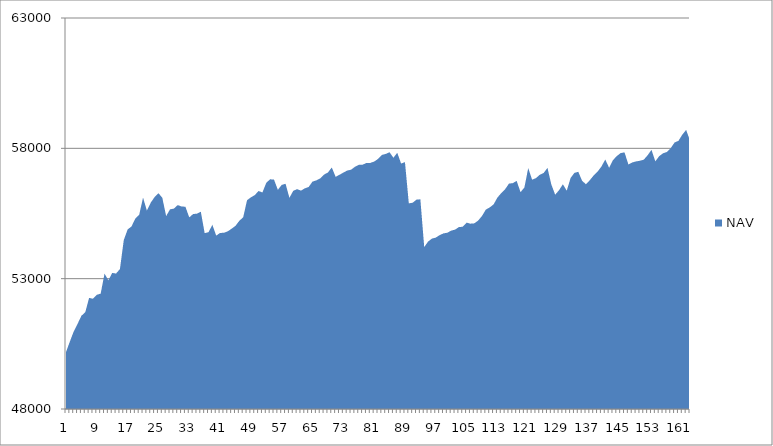
| Category | NAV |
|---|---|
| 0 | 50185.185 |
| 1 | 50585.185 |
| 2 | 50973.977 |
| 3 | 51265.977 |
| 4 | 51576.741 |
| 5 | 51711.523 |
| 6 | 52262.893 |
| 7 | 52230.24 |
| 8 | 52381.556 |
| 9 | 52425.915 |
| 10 | 53192.581 |
| 11 | 52939.146 |
| 12 | 53220.069 |
| 13 | 53197.341 |
| 14 | 53369.61 |
| 15 | 54480.721 |
| 16 | 54888.365 |
| 17 | 55001.902 |
| 18 | 55308.308 |
| 19 | 55448.308 |
| 20 | 56110.305 |
| 21 | 55610.305 |
| 22 | 55916.954 |
| 23 | 56129.798 |
| 24 | 56279.798 |
| 25 | 56105.301 |
| 26 | 55401.645 |
| 27 | 55657.201 |
| 28 | 55686.925 |
| 29 | 55823.001 |
| 30 | 55769.596 |
| 31 | 55759.375 |
| 32 | 55350.284 |
| 33 | 55480.284 |
| 34 | 55492.498 |
| 35 | 55570.42 |
| 36 | 54746.89 |
| 37 | 54783.7 |
| 38 | 55066.459 |
| 39 | 54651.074 |
| 40 | 54754.078 |
| 41 | 54760.213 |
| 42 | 54816.924 |
| 43 | 54917.296 |
| 44 | 55025.73 |
| 45 | 55220.535 |
| 46 | 55353.465 |
| 47 | 56009.309 |
| 48 | 56118.959 |
| 49 | 56205.212 |
| 50 | 56362.876 |
| 51 | 56307.394 |
| 52 | 56678.935 |
| 53 | 56813.264 |
| 54 | 56799.502 |
| 55 | 56409.112 |
| 56 | 56596.44 |
| 57 | 56640.493 |
| 58 | 56102.227 |
| 59 | 56370.449 |
| 60 | 56434.248 |
| 61 | 56376.841 |
| 62 | 56464.524 |
| 63 | 56518.022 |
| 64 | 56724.747 |
| 65 | 56770.361 |
| 66 | 56848.099 |
| 67 | 56992.896 |
| 68 | 57073.571 |
| 69 | 57266.481 |
| 70 | 56908.016 |
| 71 | 56984.939 |
| 72 | 57069.276 |
| 73 | 57147.627 |
| 74 | 57179.83 |
| 75 | 57291.17 |
| 76 | 57366.35 |
| 77 | 57371.599 |
| 78 | 57439.215 |
| 79 | 57440.895 |
| 80 | 57490.895 |
| 81 | 57593.679 |
| 82 | 57746.643 |
| 83 | 57785.413 |
| 84 | 57849.748 |
| 85 | 57639.346 |
| 86 | 57828.82 |
| 87 | 57417.055 |
| 88 | 57471.335 |
| 89 | 55888.376 |
| 90 | 55913.907 |
| 91 | 56031.989 |
| 92 | 56044.711 |
| 93 | 54210.631 |
| 94 | 54422.612 |
| 95 | 54536.647 |
| 96 | 54575.903 |
| 97 | 54670.229 |
| 98 | 54737.367 |
| 99 | 54762.386 |
| 100 | 54842.923 |
| 101 | 54881.385 |
| 102 | 54978.816 |
| 103 | 54991.283 |
| 104 | 55149.699 |
| 105 | 55109.498 |
| 106 | 55121.656 |
| 107 | 55227.569 |
| 108 | 55405.15 |
| 109 | 55650.183 |
| 110 | 55733.424 |
| 111 | 55846.244 |
| 112 | 56110.95 |
| 113 | 56283.172 |
| 114 | 56430.541 |
| 115 | 56648.489 |
| 116 | 56663.919 |
| 117 | 56752.272 |
| 118 | 56318.108 |
| 119 | 56496.442 |
| 120 | 57240.145 |
| 121 | 56797.081 |
| 122 | 56857.303 |
| 123 | 56985.874 |
| 124 | 57053.805 |
| 125 | 57249.117 |
| 126 | 56612.311 |
| 127 | 56221.507 |
| 128 | 56394.346 |
| 129 | 56622.008 |
| 130 | 56375.255 |
| 131 | 56862.384 |
| 132 | 57060.137 |
| 133 | 57099.524 |
| 134 | 56750.37 |
| 135 | 56622.71 |
| 136 | 56780.605 |
| 137 | 56961.84 |
| 138 | 57105.4 |
| 139 | 57301.96 |
| 140 | 57570.545 |
| 141 | 57256.886 |
| 142 | 57545.679 |
| 143 | 57705.679 |
| 144 | 57817.679 |
| 145 | 57845.512 |
| 146 | 57383.973 |
| 147 | 57457.609 |
| 148 | 57498.333 |
| 149 | 57523.57 |
| 150 | 57565.004 |
| 151 | 57735.592 |
| 152 | 57941.474 |
| 153 | 57502.813 |
| 154 | 57699.914 |
| 155 | 57809.005 |
| 156 | 57860.434 |
| 157 | 58009.271 |
| 158 | 58224.271 |
| 159 | 58286.771 |
| 160 | 58524.271 |
| 161 | 58705.88 |
| 162 | 58298.237 |